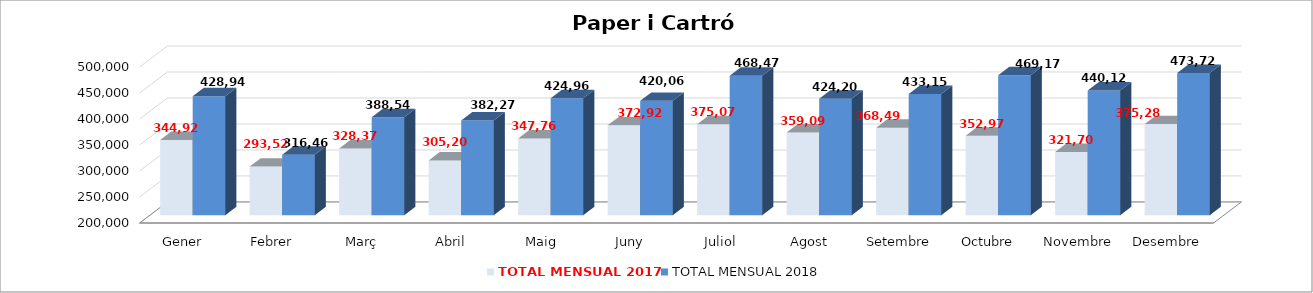
| Category | TOTAL MENSUAL 2017 | TOTAL MENSUAL 2018 |
|---|---|---|
| Gener | 344921.04 | 428940.29 |
| Febrer | 293520.02 | 316460 |
| Març | 328374.52 | 388541.77 |
| Abril | 305202.86 | 382269.98 |
| Maig | 347762 | 424968.32 |
| Juny | 372928.59 | 420061.57 |
| Juliol | 375079.29 | 468469.93 |
| Agost | 359090.86 | 424207.91 |
| Setembre | 368494.88 | 433149.97 |
| Octubre | 352978.15 | 469174.91 |
| Novembre | 321699.99 | 440119.99 |
| Desembre | 375279.98 | 473719.94 |